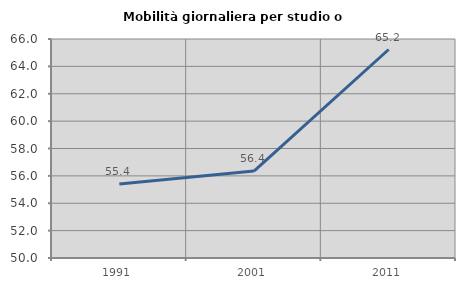
| Category | Mobilità giornaliera per studio o lavoro |
|---|---|
| 1991.0 | 55.399 |
| 2001.0 | 56.352 |
| 2011.0 | 65.233 |